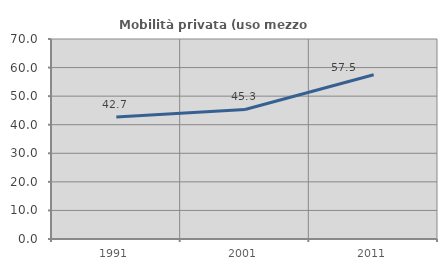
| Category | Mobilità privata (uso mezzo privato) |
|---|---|
| 1991.0 | 42.739 |
| 2001.0 | 45.333 |
| 2011.0 | 57.469 |